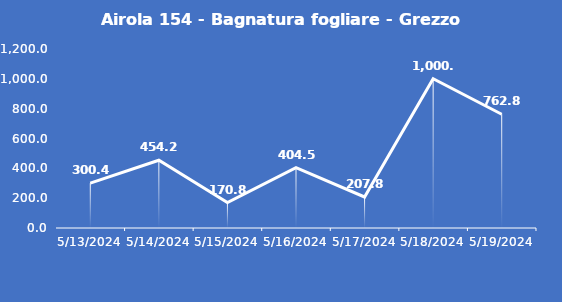
| Category | Airola 154 - Bagnatura fogliare - Grezzo (min) |
|---|---|
| 5/13/24 | 300.4 |
| 5/14/24 | 454.2 |
| 5/15/24 | 170.8 |
| 5/16/24 | 404.5 |
| 5/17/24 | 207.8 |
| 5/18/24 | 1000.8 |
| 5/19/24 | 762.8 |